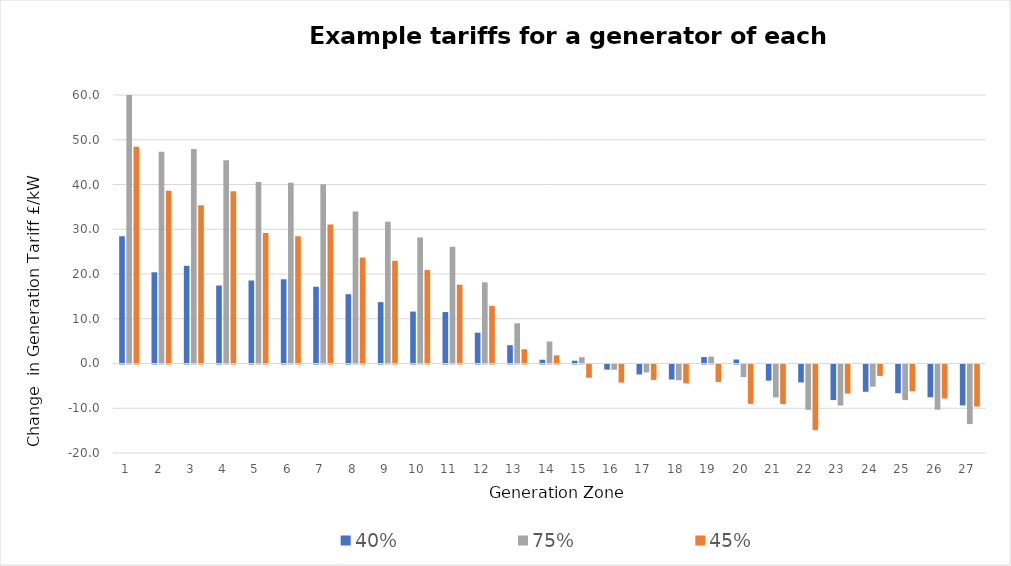
| Category | 40% | 75% | 45% |
|---|---|---|---|
| 1.0 | 28.418 | 63.001 | 48.431 |
| 2.0 | 20.384 | 47.324 | 38.604 |
| 3.0 | 21.831 | 47.917 | 35.346 |
| 4.0 | 17.427 | 45.4 | 38.491 |
| 5.0 | 18.547 | 40.57 | 29.188 |
| 6.0 | 18.823 | 40.364 | 28.444 |
| 7.0 | 17.15 | 40.048 | 31.086 |
| 8.0 | 15.485 | 33.939 | 23.68 |
| 9.0 | 13.717 | 31.685 | 22.946 |
| 10.0 | 11.603 | 28.163 | 20.879 |
| 11.0 | 11.498 | 26.086 | 17.593 |
| 12.0 | 6.875 | 18.134 | 12.862 |
| 13.0 | 4.093 | 8.985 | 3.189 |
| 14.0 | 0.839 | 4.912 | 1.826 |
| 15.0 | 0.621 | 1.395 | -2.948 |
| 16.0 | -1.147 | -1.171 | -4.051 |
| 17.0 | -2.22 | -1.771 | -3.443 |
| 18.0 | -3.361 | -3.511 | -4.213 |
| 19.0 | 1.44 | 1.536 | -3.897 |
| 20.0 | 0.893 | -2.814 | -8.786 |
| 21.0 | -3.61 | -7.365 | -8.847 |
| 22.0 | -4.005 | -10.133 | -14.668 |
| 23.0 | -7.948 | -9.167 | -6.485 |
| 24.0 | -6.098 | -4.957 | -2.552 |
| 25.0 | -6.417 | -7.958 | -6 |
| 26.0 | -7.329 | -10.102 | -7.585 |
| 27.0 | -9.139 | -13.323 | -9.399 |